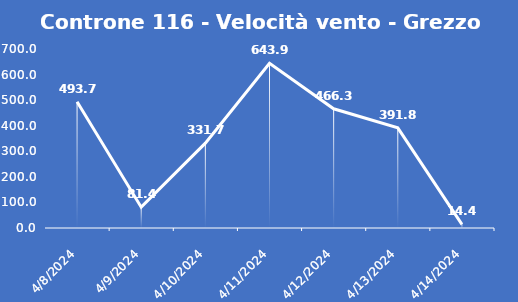
| Category | Controne 116 - Velocità vento - Grezzo (min) |
|---|---|
| 4/8/24 | 493.7 |
| 4/9/24 | 81.4 |
| 4/10/24 | 331.7 |
| 4/11/24 | 643.9 |
| 4/12/24 | 466.3 |
| 4/13/24 | 391.8 |
| 4/14/24 | 14.4 |